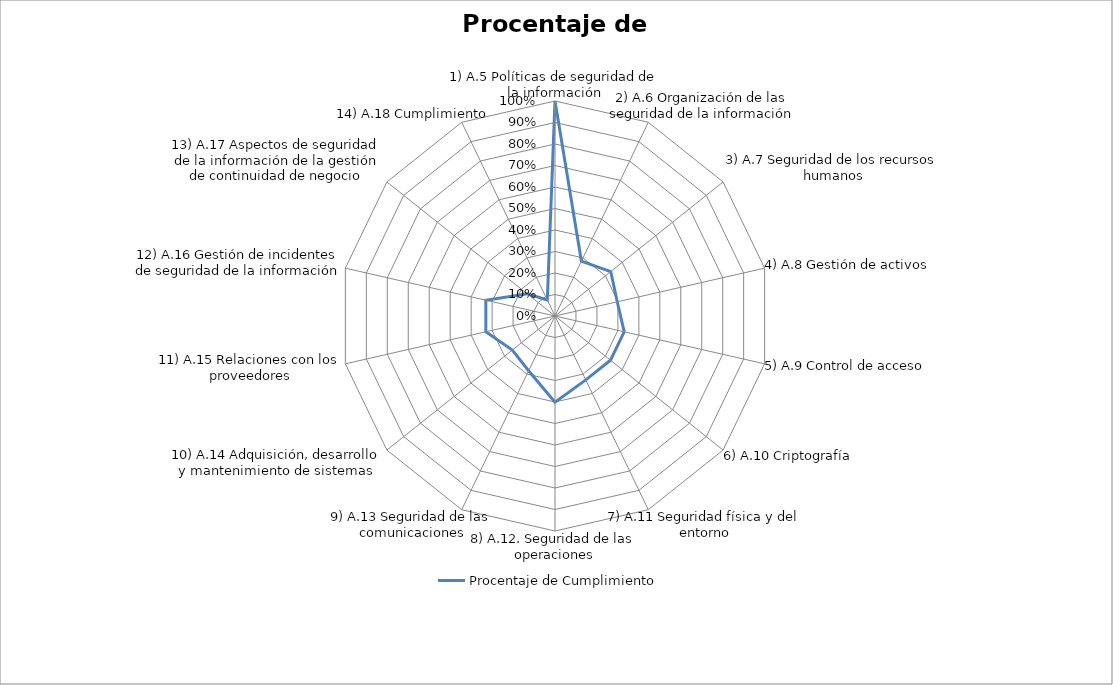
| Category | Procentaje de Cumplimiento |
|---|---|
| 1) A.5 Políticas de seguridad de la información | 1 |
| 2) A.6 Organización de las seguridad de la información | 0.283 |
| 3) A.7 Seguridad de los recursos humanos | 0.332 |
| 4) A.8 Gestión de activos | 0.297 |
| 5) A.9 Control de acceso | 0.33 |
| 6) A.10 Criptografía | 0.33 |
| 7) A.11 Seguridad física y del entorno | 0.33 |
| 8) A.12. Seguridad de las operaciones | 0.401 |
| 9) A.13 Seguridad de las comunicaciones | 0.283 |
| 10) A.14 Adquisición, desarrollo y mantenimiento de sistemas | 0.254 |
| 11) A.15 Relaciones con los proveedores | 0.33 |
| 12) A.16 Gestión de incidentes de seguridad de la información | 0.33 |
| 13) A.17 Aspectos de seguridad de la información de la gestión de continuidad de negocio | 0.165 |
| 14) A.18 Cumplimiento | 0.082 |